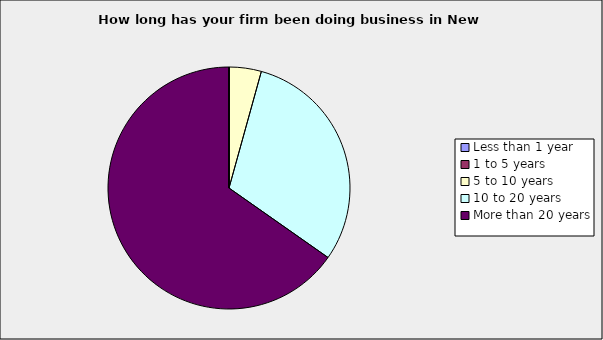
| Category | Series 0 |
|---|---|
| Less than 1 year | 0 |
| 1 to 5 years | 0 |
| 5 to 10 years | 0.043 |
| 10 to 20 years | 0.304 |
| More than 20 years | 0.652 |